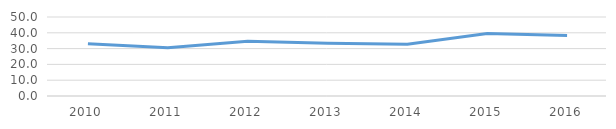
| Category | Proporción de Obligaciones Financieras del Ingreso Total |
|---|---|
| 2010.0 | 33.002 |
| 2011.0 | 30.475 |
| 2012.0 | 34.652 |
| 2013.0 | 33.465 |
| 2014.0 | 32.787 |
| 2015.0 | 39.618 |
| 2016.0 | 38.27 |